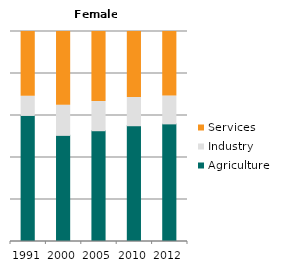
| Category | Agriculture | Industry | Services |
|---|---|---|---|
| 1991.0 | 60.023 | 9.149 | 30.829 |
| 2000.0 | 50.536 | 14.358 | 35.106 |
| 2005.0 | 52.749 | 13.9 | 33.351 |
| 2010.0 | 55.126 | 13.497 | 31.377 |
| 2012.0 | 56.01 | 13.322 | 30.667 |